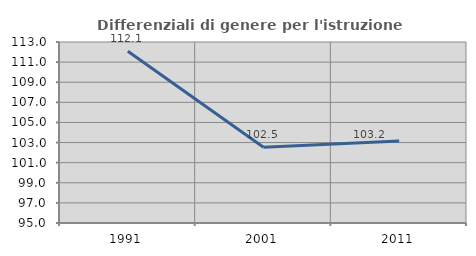
| Category | Differenziali di genere per l'istruzione superiore |
|---|---|
| 1991.0 | 112.082 |
| 2001.0 | 102.524 |
| 2011.0 | 103.155 |